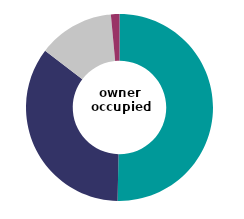
| Category | owner occupied |
|---|---|
| two or more bedrooms above the number required | 50.33 |
| one bedroom above the number required | 35.042 |
| room required met rooms available | 13.153 |
| overcrowded | 1.475 |